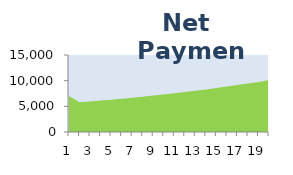
| Category | Net 
Payment |
|---|---|
| 0 | 7031.421 |
| 1 | 5777.521 |
| 2 | 5944.871 |
| 3 | 6118.676 |
| 4 | 6299.251 |
| 5 | 6486.93 |
| 6 | 6682.065 |
| 7 | 6885.026 |
| 8 | 7096.205 |
| 9 | 7316.016 |
| 10 | 7544.897 |
| 11 | 7783.31 |
| 12 | 8031.741 |
| 13 | 8290.707 |
| 14 | 8560.752 |
| 15 | 8842.452 |
| 16 | 9136.415 |
| 17 | 9443.284 |
| 18 | 9763.739 |
| 19 | 10098.498 |